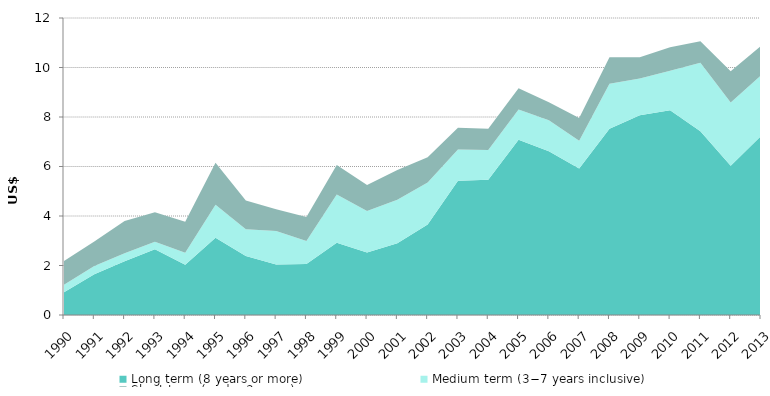
| Category | Long term (8 years or more) | Medium term (3−7 years inclusive) | Short term (under 3 years) |
|---|---|---|---|
| 1990.0 | 0.92 | 0.302 | 0.958 |
| 1991.0 | 1.649 | 0.328 | 0.997 |
| 1992.0 | 2.168 | 0.327 | 1.308 |
| 1993.0 | 2.659 | 0.304 | 1.193 |
| 1994.0 | 2.03 | 0.481 | 1.258 |
| 1995.0 | 3.126 | 1.324 | 1.705 |
| 1996.0 | 2.386 | 1.078 | 1.165 |
| 1997.0 | 2.042 | 1.355 | 0.875 |
| 1998.0 | 2.056 | 0.937 | 0.969 |
| 1999.0 | 2.915 | 1.955 | 1.194 |
| 2000.0 | 2.528 | 1.67 | 1.051 |
| 2001.0 | 2.903 | 1.75 | 1.202 |
| 2002.0 | 3.66 | 1.695 | 1.017 |
| 2003.0 | 5.425 | 1.257 | 0.878 |
| 2004.0 | 5.461 | 1.206 | 0.86 |
| 2005.0 | 7.079 | 1.221 | 0.862 |
| 2006.0 | 6.62 | 1.254 | 0.72 |
| 2007.0 | 5.916 | 1.125 | 0.923 |
| 2008.0 | 7.522 | 1.822 | 1.07 |
| 2009.0 | 8.073 | 1.479 | 0.865 |
| 2010.0 | 8.277 | 1.596 | 0.942 |
| 2011.0 | 7.421 | 2.77 | 0.868 |
| 2012.0 | 6.029 | 2.559 | 1.257 |
| 2013.0 | 7.228 | 2.455 | 1.189 |